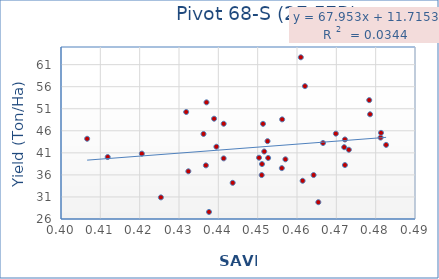
| Category | Series 0 |
|---|---|
| 0.406642 | 44.193 |
| 0.456226 | 48.59 |
| 0.469881 | 45.357 |
| 0.481251 | 44.457 |
| 0.450347 | 39.897 |
| 0.451358 | 47.577 |
| 0.451105 | 38.457 |
| 0.457054 | 39.537 |
| 0.481357 | 45.533 |
| 0.437628 | 27.6 |
| 0.420554 | 40.82 |
| 0.44136 | 47.593 |
| 0.472186 | 44.033 |
| 0.425399 | 30.9 |
| 0.451028 | 36.813 |
| 0.452509 | 35.96 |
| 0.466617 | 43.65 |
| 0.482654 | 43.227 |
| 0.478574 | 42.803 |
| 0.472188 | 49.743 |
| 0.438919 | 38.233 |
| 0.45167 | 48.74 |
| 0.436232 | 41.3 |
| 0.44365 | 45.283 |
| 0.456144 | 34.2 |
| 0.465423 | 40.053 |
| 0.461428 | 37.533 |
| 0.431827 | 29.81 |
| 0.436837 | 34.667 |
| 0.460971 | 50.267 |
| 0.43951 | 38.16 |
| 0.441353 | 39.84 |
| 0.464223 | 62.667 |
| 0.462026 | 42.387 |
| 0.472 | 39.747 |
| 0.43699 | 35.967 |
| 0.478365 | 56.123 |
| 0.473175 | 42.28 |
| 0.454316 | 52.45 |
| 0.47945 | 52.953 |
| 0.454224 | 41.7 |